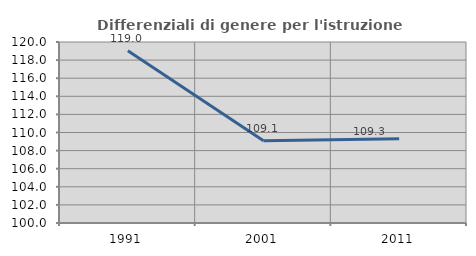
| Category | Differenziali di genere per l'istruzione superiore |
|---|---|
| 1991.0 | 119.037 |
| 2001.0 | 109.092 |
| 2011.0 | 109.322 |